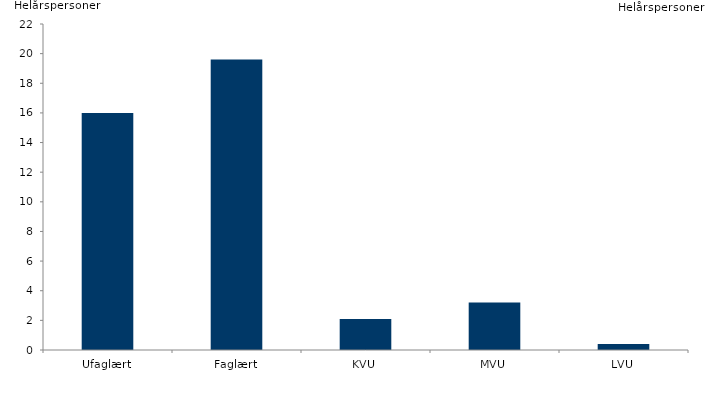
| Category | Serie1 |
|---|---|
| Ufaglært | 16 |
| Faglært | 19.6 |
| KVU | 2.1 |
| MVU | 3.2 |
| LVU | 0.4 |